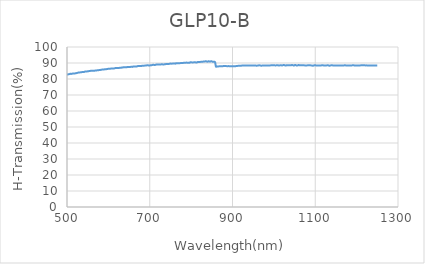
| Category | Series 0 |
|---|---|
| 500.0 | 82.901 |
| 502.0 | 82.85 |
| 504.0 | 82.97 |
| 506.0 | 83.077 |
| 508.0 | 83.278 |
| 510.0 | 83.183 |
| 512.0 | 83.296 |
| 514.0 | 83.429 |
| 516.0 | 83.495 |
| 518.0 | 83.434 |
| 520.0 | 83.538 |
| 522.0 | 83.63 |
| 524.0 | 83.757 |
| 526.0 | 83.897 |
| 528.0 | 84.043 |
| 530.0 | 84.08 |
| 532.0 | 84.141 |
| 534.0 | 84.165 |
| 536.0 | 84.289 |
| 538.0 | 84.413 |
| 540.0 | 84.313 |
| 542.0 | 84.499 |
| 544.0 | 84.677 |
| 546.0 | 84.637 |
| 548.0 | 84.677 |
| 550.0 | 84.816 |
| 552.0 | 84.86 |
| 554.0 | 85.033 |
| 556.0 | 85.068 |
| 558.0 | 85.102 |
| 560.0 | 85.118 |
| 562.0 | 85.147 |
| 564.0 | 85.169 |
| 566.0 | 85.137 |
| 568.0 | 85.258 |
| 570.0 | 85.315 |
| 572.0 | 85.387 |
| 574.0 | 85.528 |
| 576.0 | 85.466 |
| 578.0 | 85.611 |
| 580.0 | 85.647 |
| 582.0 | 85.75 |
| 584.0 | 85.838 |
| 586.0 | 85.943 |
| 588.0 | 85.979 |
| 590.0 | 85.976 |
| 592.0 | 86.138 |
| 594.0 | 86.083 |
| 596.0 | 86.184 |
| 598.0 | 86.28 |
| 600.0 | 86.395 |
| 602.0 | 86.417 |
| 604.0 | 86.371 |
| 606.0 | 86.503 |
| 608.0 | 86.497 |
| 610.0 | 86.505 |
| 612.0 | 86.507 |
| 614.0 | 86.608 |
| 616.0 | 86.765 |
| 618.0 | 86.924 |
| 620.0 | 86.844 |
| 622.0 | 86.911 |
| 624.0 | 86.842 |
| 626.0 | 86.905 |
| 628.0 | 87.069 |
| 630.0 | 86.959 |
| 632.0 | 87.135 |
| 634.0 | 87.125 |
| 636.0 | 87.327 |
| 638.0 | 87.33 |
| 640.0 | 87.367 |
| 642.0 | 87.339 |
| 644.0 | 87.346 |
| 646.0 | 87.488 |
| 648.0 | 87.505 |
| 650.0 | 87.551 |
| 652.0 | 87.47 |
| 654.0 | 87.61 |
| 656.0 | 87.681 |
| 658.0 | 87.555 |
| 660.0 | 87.819 |
| 662.0 | 87.835 |
| 664.0 | 87.8 |
| 666.0 | 87.874 |
| 668.0 | 87.83 |
| 670.0 | 87.975 |
| 672.0 | 88.115 |
| 674.0 | 88.203 |
| 676.0 | 88.112 |
| 678.0 | 88.176 |
| 680.0 | 88.146 |
| 682.0 | 88.305 |
| 684.0 | 88.281 |
| 686.0 | 88.321 |
| 688.0 | 88.373 |
| 690.0 | 88.423 |
| 692.0 | 88.497 |
| 694.0 | 88.557 |
| 696.0 | 88.557 |
| 698.0 | 88.393 |
| 700.0 | 88.421 |
| 702.0 | 88.602 |
| 704.0 | 88.569 |
| 706.0 | 88.732 |
| 708.0 | 88.868 |
| 710.0 | 88.823 |
| 712.0 | 88.698 |
| 714.0 | 88.918 |
| 716.0 | 89.003 |
| 718.0 | 89.016 |
| 720.0 | 89.072 |
| 722.0 | 89.076 |
| 724.0 | 89.033 |
| 726.0 | 89.083 |
| 728.0 | 89.159 |
| 730.0 | 89.21 |
| 732.0 | 89.09 |
| 734.0 | 89.099 |
| 736.0 | 89.195 |
| 738.0 | 89.273 |
| 740.0 | 89.388 |
| 742.0 | 89.322 |
| 744.0 | 89.449 |
| 746.0 | 89.409 |
| 748.0 | 89.544 |
| 750.0 | 89.613 |
| 752.0 | 89.606 |
| 754.0 | 89.593 |
| 756.0 | 89.69 |
| 758.0 | 89.639 |
| 760.0 | 89.692 |
| 762.0 | 89.595 |
| 764.0 | 89.896 |
| 766.0 | 89.8 |
| 768.0 | 89.86 |
| 770.0 | 89.885 |
| 772.0 | 89.872 |
| 774.0 | 89.926 |
| 776.0 | 90.011 |
| 778.0 | 89.997 |
| 780.0 | 90.031 |
| 782.0 | 90.104 |
| 784.0 | 90.181 |
| 786.0 | 90.082 |
| 788.0 | 90.245 |
| 790.0 | 90.218 |
| 792.0 | 90.136 |
| 794.0 | 90.192 |
| 796.0 | 90.084 |
| 798.0 | 90.458 |
| 800.0 | 90.426 |
| 802.0 | 90.375 |
| 804.0 | 90.328 |
| 806.0 | 90.395 |
| 808.0 | 90.43 |
| 810.0 | 90.431 |
| 812.0 | 90.328 |
| 814.0 | 90.35 |
| 816.0 | 90.612 |
| 818.0 | 90.679 |
| 820.0 | 90.624 |
| 822.0 | 90.683 |
| 824.0 | 90.75 |
| 826.0 | 90.845 |
| 828.0 | 90.755 |
| 830.0 | 90.957 |
| 832.0 | 90.878 |
| 834.0 | 91.015 |
| 836.0 | 91.076 |
| 838.0 | 90.881 |
| 840.0 | 90.846 |
| 842.0 | 91.103 |
| 844.0 | 90.924 |
| 846.0 | 90.866 |
| 848.0 | 91.072 |
| 850.0 | 91.037 |
| 852.0 | 90.768 |
| 854.0 | 90.773 |
| 856.0 | 90.822 |
| 858.0 | 90.379 |
| 860.0 | 87.781 |
| 862.0 | 87.834 |
| 864.0 | 87.867 |
| 866.0 | 87.859 |
| 868.0 | 87.948 |
| 870.0 | 87.954 |
| 872.0 | 87.943 |
| 874.0 | 87.952 |
| 876.0 | 87.996 |
| 878.0 | 88.077 |
| 880.0 | 88.097 |
| 882.0 | 88.095 |
| 884.0 | 88.073 |
| 886.0 | 88.034 |
| 888.0 | 88.006 |
| 890.0 | 88.046 |
| 892.0 | 88.04 |
| 894.0 | 88.018 |
| 896.0 | 87.991 |
| 898.0 | 87.952 |
| 900.0 | 87.947 |
| 902.0 | 87.923 |
| 904.0 | 87.922 |
| 906.0 | 87.952 |
| 908.0 | 88.037 |
| 910.0 | 88.146 |
| 912.0 | 88.182 |
| 914.0 | 88.232 |
| 916.0 | 88.307 |
| 918.0 | 88.315 |
| 920.0 | 88.322 |
| 922.0 | 88.353 |
| 924.0 | 88.418 |
| 926.0 | 88.399 |
| 928.0 | 88.436 |
| 930.0 | 88.408 |
| 932.0 | 88.396 |
| 934.0 | 88.387 |
| 936.0 | 88.402 |
| 938.0 | 88.41 |
| 940.0 | 88.441 |
| 942.0 | 88.434 |
| 944.0 | 88.44 |
| 946.0 | 88.432 |
| 948.0 | 88.413 |
| 950.0 | 88.409 |
| 952.0 | 88.485 |
| 954.0 | 88.437 |
| 956.0 | 88.434 |
| 958.0 | 88.307 |
| 960.0 | 88.362 |
| 962.0 | 88.424 |
| 964.0 | 88.556 |
| 966.0 | 88.514 |
| 968.0 | 88.383 |
| 970.0 | 88.318 |
| 972.0 | 88.44 |
| 974.0 | 88.509 |
| 976.0 | 88.456 |
| 978.0 | 88.411 |
| 980.0 | 88.408 |
| 982.0 | 88.42 |
| 984.0 | 88.452 |
| 986.0 | 88.438 |
| 988.0 | 88.446 |
| 990.0 | 88.485 |
| 992.0 | 88.517 |
| 994.0 | 88.54 |
| 996.0 | 88.656 |
| 998.0 | 88.638 |
| 1000.0 | 88.546 |
| 1002.0 | 88.522 |
| 1004.0 | 88.505 |
| 1006.0 | 88.526 |
| 1008.0 | 88.552 |
| 1010.0 | 88.532 |
| 1012.0 | 88.486 |
| 1014.0 | 88.501 |
| 1016.0 | 88.605 |
| 1018.0 | 88.547 |
| 1020.0 | 88.49 |
| 1022.0 | 88.629 |
| 1024.0 | 88.745 |
| 1026.0 | 88.613 |
| 1028.0 | 88.405 |
| 1030.0 | 88.517 |
| 1032.0 | 88.662 |
| 1034.0 | 88.558 |
| 1036.0 | 88.553 |
| 1038.0 | 88.577 |
| 1040.0 | 88.519 |
| 1042.0 | 88.609 |
| 1044.0 | 88.781 |
| 1046.0 | 88.598 |
| 1048.0 | 88.401 |
| 1050.0 | 88.619 |
| 1052.0 | 88.774 |
| 1054.0 | 88.529 |
| 1056.0 | 88.354 |
| 1058.0 | 88.587 |
| 1060.0 | 88.741 |
| 1062.0 | 88.531 |
| 1064.0 | 88.537 |
| 1066.0 | 88.551 |
| 1068.0 | 88.539 |
| 1070.0 | 88.556 |
| 1072.0 | 88.55 |
| 1074.0 | 88.511 |
| 1076.0 | 88.51 |
| 1078.0 | 88.507 |
| 1080.0 | 88.498 |
| 1082.0 | 88.554 |
| 1084.0 | 88.621 |
| 1086.0 | 88.659 |
| 1088.0 | 88.538 |
| 1090.0 | 88.498 |
| 1092.0 | 88.423 |
| 1094.0 | 88.289 |
| 1096.0 | 88.378 |
| 1098.0 | 88.604 |
| 1100.0 | 88.625 |
| 1102.0 | 88.495 |
| 1104.0 | 88.48 |
| 1106.0 | 88.503 |
| 1108.0 | 88.494 |
| 1110.0 | 88.458 |
| 1112.0 | 88.436 |
| 1114.0 | 88.474 |
| 1116.0 | 88.595 |
| 1118.0 | 88.552 |
| 1120.0 | 88.507 |
| 1122.0 | 88.495 |
| 1124.0 | 88.483 |
| 1126.0 | 88.496 |
| 1128.0 | 88.522 |
| 1130.0 | 88.624 |
| 1132.0 | 88.511 |
| 1134.0 | 88.291 |
| 1136.0 | 88.415 |
| 1138.0 | 88.531 |
| 1140.0 | 88.668 |
| 1142.0 | 88.495 |
| 1144.0 | 88.458 |
| 1146.0 | 88.45 |
| 1148.0 | 88.427 |
| 1150.0 | 88.444 |
| 1152.0 | 88.447 |
| 1154.0 | 88.434 |
| 1156.0 | 88.468 |
| 1158.0 | 88.466 |
| 1160.0 | 88.418 |
| 1162.0 | 88.454 |
| 1164.0 | 88.416 |
| 1166.0 | 88.441 |
| 1168.0 | 88.44 |
| 1170.0 | 88.517 |
| 1172.0 | 88.616 |
| 1174.0 | 88.472 |
| 1176.0 | 88.456 |
| 1178.0 | 88.472 |
| 1180.0 | 88.464 |
| 1182.0 | 88.462 |
| 1184.0 | 88.473 |
| 1186.0 | 88.474 |
| 1188.0 | 88.495 |
| 1190.0 | 88.541 |
| 1192.0 | 88.542 |
| 1194.0 | 88.513 |
| 1196.0 | 88.487 |
| 1198.0 | 88.475 |
| 1200.0 | 88.459 |
| 1202.0 | 88.456 |
| 1204.0 | 88.488 |
| 1206.0 | 88.496 |
| 1208.0 | 88.495 |
| 1210.0 | 88.529 |
| 1212.0 | 88.533 |
| 1214.0 | 88.537 |
| 1216.0 | 88.536 |
| 1218.0 | 88.541 |
| 1220.0 | 88.527 |
| 1222.0 | 88.501 |
| 1224.0 | 88.516 |
| 1226.0 | 88.495 |
| 1228.0 | 88.464 |
| 1230.0 | 88.498 |
| 1232.0 | 88.497 |
| 1234.0 | 88.458 |
| 1236.0 | 88.414 |
| 1238.0 | 88.422 |
| 1240.0 | 88.441 |
| 1242.0 | 88.468 |
| 1244.0 | 88.486 |
| 1246.0 | 88.457 |
| 1248.0 | 88.481 |
| 1250.0 | 88.471 |